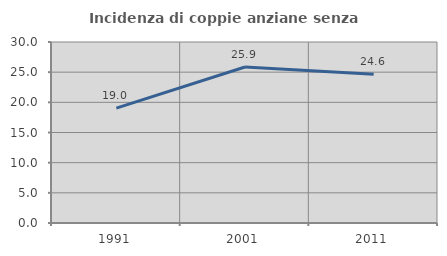
| Category | Incidenza di coppie anziane senza figli  |
|---|---|
| 1991.0 | 19.048 |
| 2001.0 | 25.862 |
| 2011.0 | 24.638 |